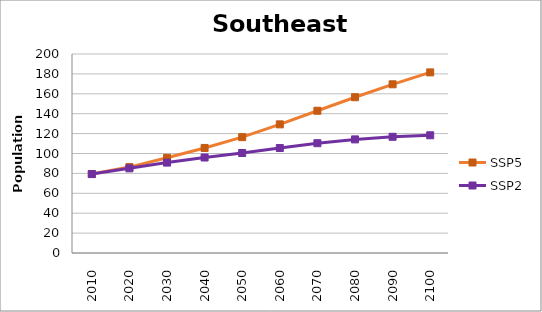
| Category | SSP5 | SSP2 |
|---|---|---|
| 2010.0 | 79346403 | 79346403 |
| 2020.0 | 86332580 | 85069973 |
| 2030.0 | 95647658 | 90850681 |
| 2040.0 | 105584787 | 95977293 |
| 2050.0 | 116440089 | 100507471 |
| 2060.0 | 129287086 | 105494062 |
| 2070.0 | 142965564 | 110353640 |
| 2080.0 | 156566431 | 114179812 |
| 2090.0 | 169544943 | 116799492 |
| 2100.0 | 181527505 | 118315764 |